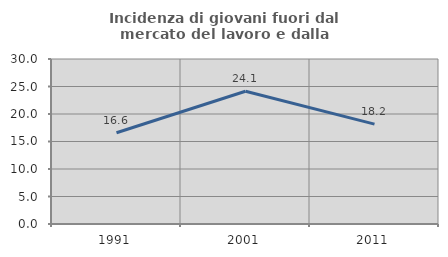
| Category | Incidenza di giovani fuori dal mercato del lavoro e dalla formazione  |
|---|---|
| 1991.0 | 16.594 |
| 2001.0 | 24.145 |
| 2011.0 | 18.165 |